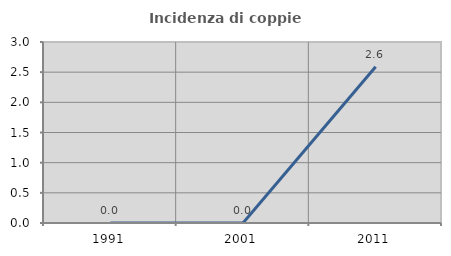
| Category | Incidenza di coppie miste |
|---|---|
| 1991.0 | 0 |
| 2001.0 | 0 |
| 2011.0 | 2.591 |